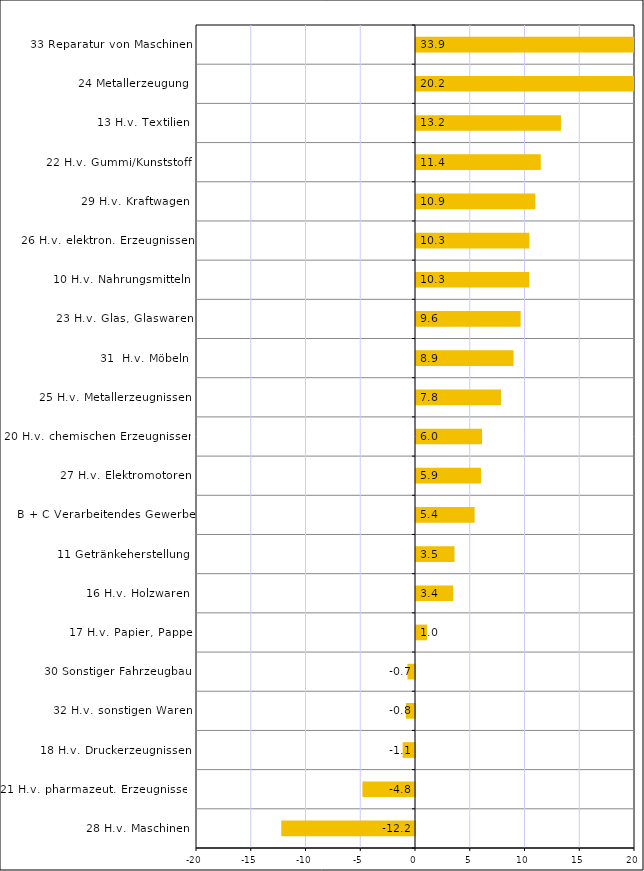
| Category | Series 0 |
|---|---|
| 28 H.v. Maschinen | -12.213 |
| 21 H.v. pharmazeut. Erzeugnissen | -4.802 |
| 18 H.v. Druckerzeugnissen | -1.128 |
| 32 H.v. sonstigen Waren | -0.829 |
| 30 Sonstiger Fahrzeugbau | -0.688 |
| 17 H.v. Papier, Pappe | 1.014 |
| 16 H.v. Holzwaren | 3.407 |
| 11 Getränkeherstellung | 3.518 |
| B + C Verarbeitendes Gewerbe | 5.355 |
| 27 H.v. Elektromotoren | 5.94 |
| 20 H.v. chemischen Erzeugnissen | 6.032 |
| 25 H.v. Metallerzeugnissen | 7.76 |
| 31  H.v. Möbeln | 8.909 |
| 23 H.v. Glas, Glaswaren | 9.557 |
| 10 H.v. Nahrungsmitteln | 10.334 |
| 26 H.v. elektron. Erzeugnissen | 10.349 |
| 29 H.v. Kraftwagen | 10.891 |
| 22 H.v. Gummi/Kunststoff | 11.397 |
| 13 H.v. Textilien | 13.238 |
| 24 Metallerzeugung | 20.192 |
| 33 Reparatur von Maschinen | 33.945 |